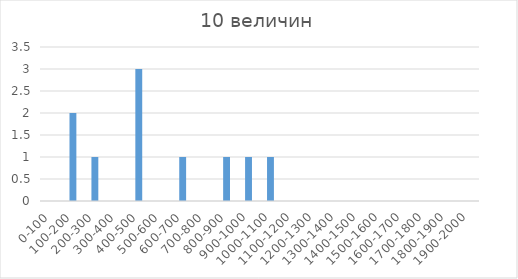
| Category | Series 0 |
|---|---|
| 0-100 | 0 |
| 100-200 | 2 |
| 200-300 | 1 |
| 300-400 | 0 |
| 400-500 | 3 |
| 500-600 | 0 |
| 600-700 | 1 |
| 700-800 | 0 |
| 800-900 | 1 |
| 900-1000 | 1 |
| 1000-1100 | 1 |
| 1100-1200 | 0 |
| 1200-1300 | 0 |
| 1300-1400 | 0 |
| 1400-1500 | 0 |
| 1500-1600 | 0 |
| 1600-1700 | 0 |
| 1700-1800 | 0 |
| 1800-1900 | 0 |
| 1900-2000 | 0 |